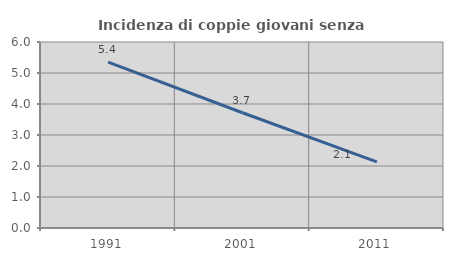
| Category | Incidenza di coppie giovani senza figli |
|---|---|
| 1991.0 | 5.35 |
| 2001.0 | 3.718 |
| 2011.0 | 2.134 |